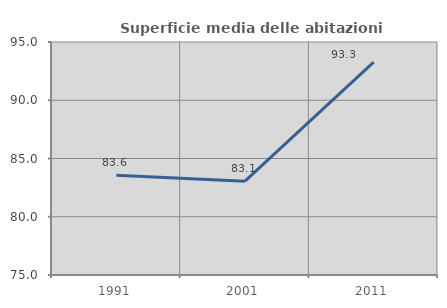
| Category | Superficie media delle abitazioni occupate |
|---|---|
| 1991.0 | 83.557 |
| 2001.0 | 83.054 |
| 2011.0 | 93.265 |